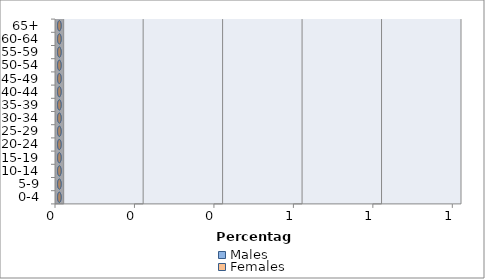
| Category | Males | Females |
|---|---|---|
| 0-4 | 0 | 0 |
| 5-9 | 0 | 0 |
| 10-14 | 0 | 0 |
| 15-19 | 0 | 0 |
| 20-24 | 0 | 0 |
| 25-29 | 0 | 0 |
| 30-34 | 0 | 0 |
| 35-39 | 0 | 0 |
| 40-44 | 0 | 0 |
| 45-49 | 0 | 0 |
| 50-54 | 0 | 0 |
| 55-59 | 0 | 0 |
| 60-64 | 0 | 0 |
| 65+ | 0 | 0 |